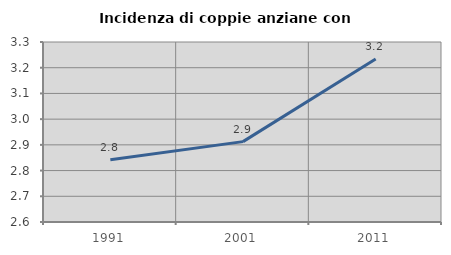
| Category | Incidenza di coppie anziane con figli |
|---|---|
| 1991.0 | 2.842 |
| 2001.0 | 2.913 |
| 2011.0 | 3.234 |